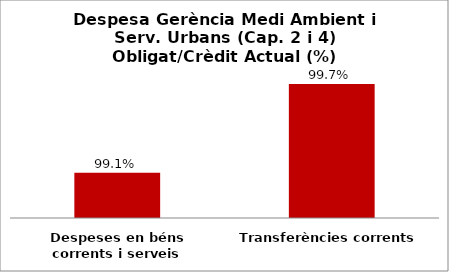
| Category | Series 0 |
|---|---|
| Despeses en béns corrents i serveis | 0.991 |
| Transferències corrents | 0.997 |